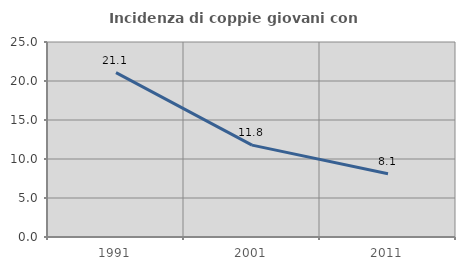
| Category | Incidenza di coppie giovani con figli |
|---|---|
| 1991.0 | 21.077 |
| 2001.0 | 11.776 |
| 2011.0 | 8.12 |